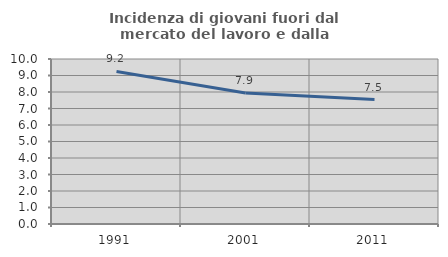
| Category | Incidenza di giovani fuori dal mercato del lavoro e dalla formazione  |
|---|---|
| 1991.0 | 9.244 |
| 2001.0 | 7.939 |
| 2011.0 | 7.545 |